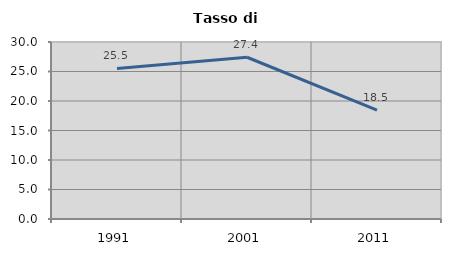
| Category | Tasso di disoccupazione   |
|---|---|
| 1991.0 | 25.522 |
| 2001.0 | 27.413 |
| 2011.0 | 18.454 |